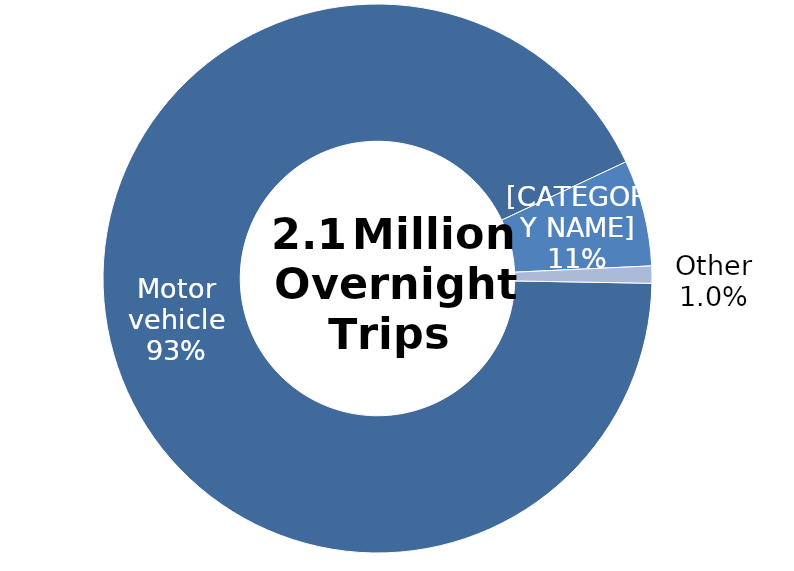
| Category | Series 0 |
|---|---|
| Motor vehicle | 1921635 |
| Rail/ Bus/Coach | 129648 |
| Other | 20917 |